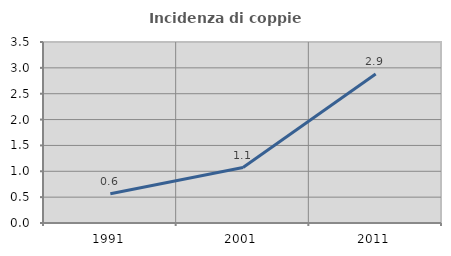
| Category | Incidenza di coppie miste |
|---|---|
| 1991.0 | 0.565 |
| 2001.0 | 1.071 |
| 2011.0 | 2.882 |